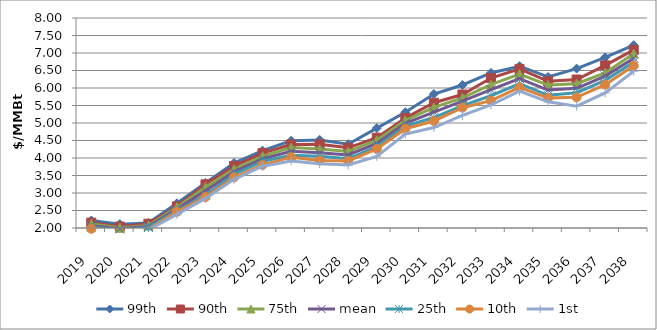
| Category | 99th | 90th | 75th | mean | 25th | 10th | 1st |
|---|---|---|---|---|---|---|---|
| 2019.0 | 2.215 | 2.154 | 2.116 | 2.068 | 2.022 | 1.978 | 1.94 |
| 2020.0 | 2.111 | 2.04 | 2.007 | 1.976 | 1.941 | 1.914 | 1.846 |
| 2021.0 | 2.144 | 2.122 | 2.073 | 2.044 | 2.013 | 1.964 | 1.947 |
| 2022.0 | 2.705 | 2.618 | 2.595 | 2.539 | 2.49 | 2.462 | 2.39 |
| 2023.0 | 3.288 | 3.249 | 3.167 | 3.061 | 2.937 | 2.887 | 2.846 |
| 2024.0 | 3.856 | 3.77 | 3.677 | 3.608 | 3.538 | 3.45 | 3.39 |
| 2025.0 | 4.212 | 4.141 | 4.05 | 3.977 | 3.906 | 3.802 | 3.765 |
| 2026.0 | 4.493 | 4.387 | 4.297 | 4.193 | 4.078 | 4.024 | 3.913 |
| 2027.0 | 4.517 | 4.392 | 4.254 | 4.149 | 4.048 | 3.931 | 3.838 |
| 2028.0 | 4.393 | 4.291 | 4.184 | 4.088 | 3.977 | 3.916 | 3.8 |
| 2029.0 | 4.853 | 4.58 | 4.508 | 4.417 | 4.327 | 4.259 | 4.047 |
| 2030.0 | 5.307 | 5.14 | 5.077 | 4.992 | 4.911 | 4.836 | 4.683 |
| 2031.0 | 5.828 | 5.579 | 5.445 | 5.313 | 5.156 | 5.057 | 4.871 |
| 2032.0 | 6.086 | 5.815 | 5.72 | 5.625 | 5.496 | 5.437 | 5.216 |
| 2033.0 | 6.431 | 6.284 | 6.094 | 5.952 | 5.779 | 5.638 | 5.515 |
| 2034.0 | 6.622 | 6.545 | 6.399 | 6.27 | 6.125 | 6.015 | 5.913 |
| 2035.0 | 6.316 | 6.191 | 6.083 | 5.941 | 5.792 | 5.712 | 5.605 |
| 2036.0 | 6.554 | 6.242 | 6.124 | 5.991 | 5.864 | 5.733 | 5.482 |
| 2037.0 | 6.876 | 6.647 | 6.431 | 6.342 | 6.219 | 6.095 | 5.86 |
| 2038.0 | 7.223 | 7.089 | 6.984 | 6.851 | 6.741 | 6.637 | 6.478 |